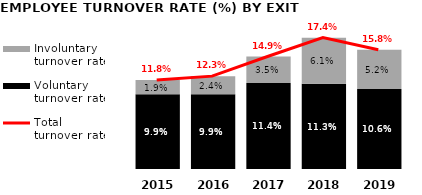
| Category | Voluntary turnover rate | Involuntary turnover rate |
|---|---|---|
| 2019.0 | 0.106 | 0.052 |
| 2018.0 | 0.113 | 0.061 |
| 2017.0 | 0.114 | 0.035 |
| 2016.0 | 0.099 | 0.024 |
| 2015.0 | 0.099 | 0.019 |